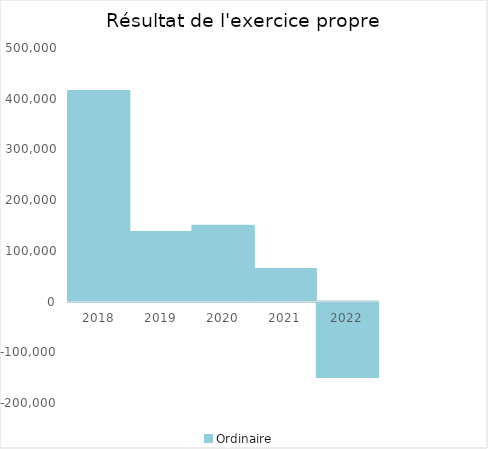
| Category |   | Ordinaire |    |
|---|---|---|---|
| 2018.0 |  | 415277.88 |  |
| 2019.0 |  | 137123.02 |  |
| 2020.0 |  | 149363.84 |  |
| 2021.0 |  | 64254.15 |  |
| 2022.0 |  | -148572.75 |  |